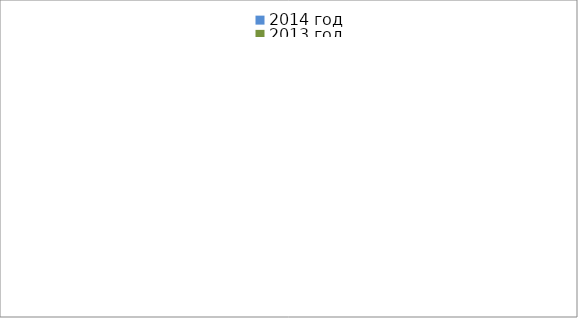
| Category | 2014 год | 2013 год |
|---|---|---|
|  - поджог | 27 | 35 |
|  - неосторожное обращение с огнём | 52 | 76 |
|  - НПТЭ электрооборудования | 21 | 22 |
|  - НПУ и Э печей | 75 | 70 |
|  - НПУ и Э транспортных средств | 74 | 64 |
|   -Шалость с огнем детей | 1 | 4 |
|  -НППБ при эксплуатации эл.приборов | 20 | 32 |
|  - курение | 22 | 14 |
| - прочие | 113 | 104 |
| - не установленные причины | 8 | 3 |